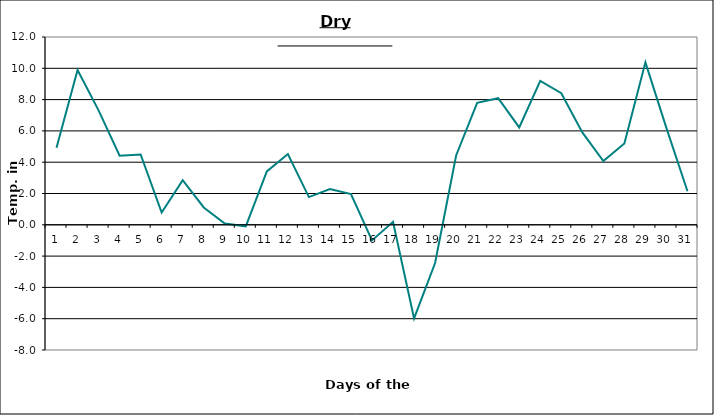
| Category | Series 0 |
|---|---|
| 0 | 4.93 |
| 1 | 9.89 |
| 2 | 7.31 |
| 3 | 4.41 |
| 4 | 4.49 |
| 5 | 0.78 |
| 6 | 2.85 |
| 7 | 1.11 |
| 8 | 0.08 |
| 9 | -0.1 |
| 10 | 3.41 |
| 11 | 4.52 |
| 12 | 1.77 |
| 13 | 2.28 |
| 14 | 1.96 |
| 15 | -1 |
| 16 | 0.19 |
| 17 | -5.98 |
| 18 | -2.44 |
| 19 | 4.43 |
| 20 | 7.79 |
| 21 | 8.09 |
| 22 | 6.22 |
| 23 | 9.2 |
| 24 | 8.41 |
| 25 | 5.9 |
| 26 | 4.07 |
| 27 | 5.2 |
| 28 | 10.38 |
| 29 | 6.18 |
| 30 | 2.14 |